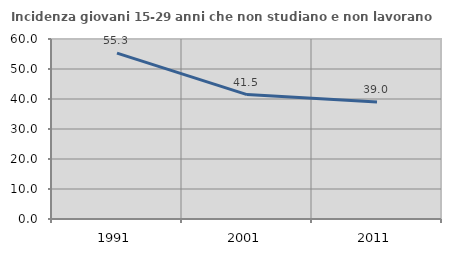
| Category | Incidenza giovani 15-29 anni che non studiano e non lavorano  |
|---|---|
| 1991.0 | 55.273 |
| 2001.0 | 41.479 |
| 2011.0 | 38.973 |